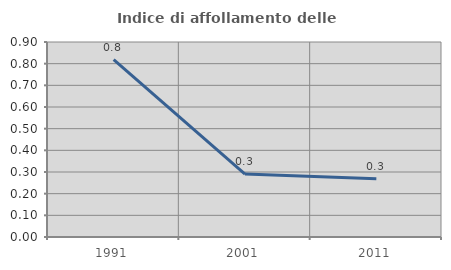
| Category | Indice di affollamento delle abitazioni  |
|---|---|
| 1991.0 | 0.819 |
| 2001.0 | 0.29 |
| 2011.0 | 0.269 |